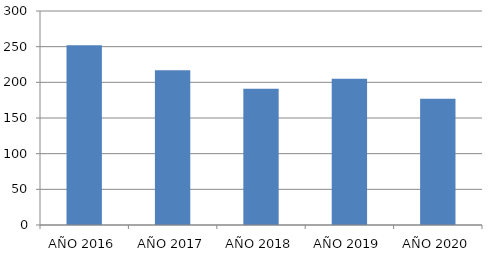
| Category | Series 0 |
|---|---|
| AÑO 2016 | 252 |
| AÑO 2017 | 217 |
| AÑO 2018 | 191 |
| AÑO 2019 | 205 |
| AÑO 2020 | 177 |